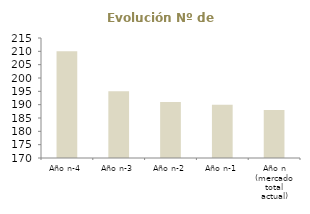
| Category | Evolución Nº de clientes |
|---|---|
| Año n-4 | 210 |
| Año n-3 | 195 |
| Año n-2 | 191 |
| Año n-1 | 190 |
| Año n (mercado total actual) | 188 |